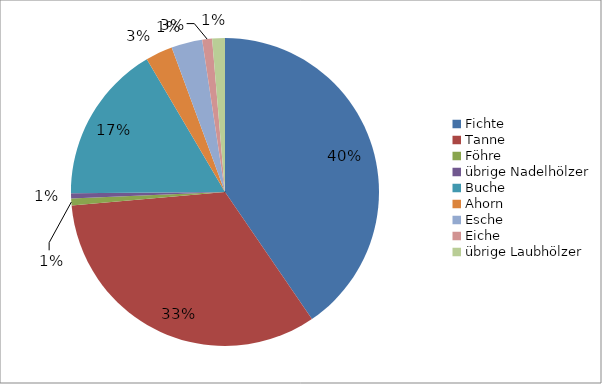
| Category | Kanton Luzern |
|---|---|
| Fichte | 160.4 |
| Tanne | 131.4 |
| Föhre | 2.9 |
| übrige Nadelhölzer | 2.2 |
| Buche | 66 |
| Ahorn | 11.3 |
| Esche | 12.9 |
| Eiche | 4.1 |
| übrige Laubhölzer | 5.3 |